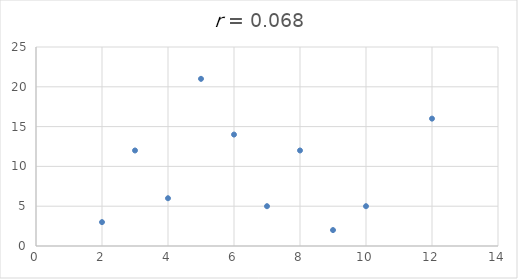
| Category | Series 0 |
|---|---|
| 2.0 | 3 |
| 4.0 | 6 |
| 7.0 | 5 |
| 5.0 | 21 |
| 8.0 | 12 |
| 6.0 | 14 |
| 9.0 | 2 |
| 12.0 | 16 |
| 3.0 | 12 |
| 10.0 | 5 |